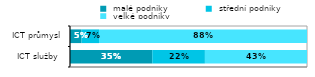
| Category |  malé podniky |  střední podniky |  velké podniky |
|---|---|---|---|
| ICT služby  | 0.347 | 0.222 | 0.431 |
| ICT průmysl | 0.049 | 0.074 | 0.878 |